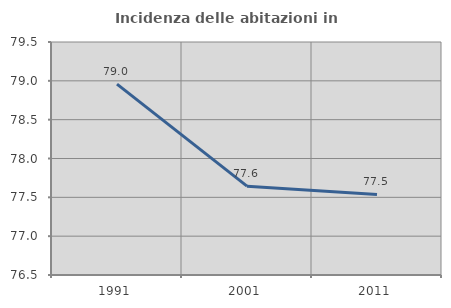
| Category | Incidenza delle abitazioni in proprietà  |
|---|---|
| 1991.0 | 78.957 |
| 2001.0 | 77.644 |
| 2011.0 | 77.538 |